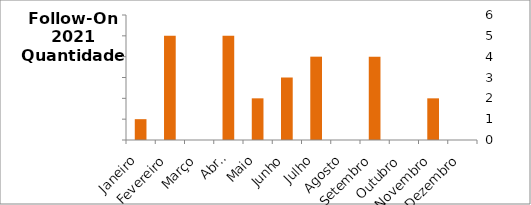
| Category | Nº |
|---|---|
| Janeiro | 1 |
| Fevereiro | 5 |
| Março | 0 |
| Abril | 5 |
| Maio | 2 |
| Junho | 3 |
| Julho | 4 |
| Agosto | 0 |
| Setembro | 4 |
| Outubro | 0 |
| Novembro | 2 |
| Dezembro | 0 |